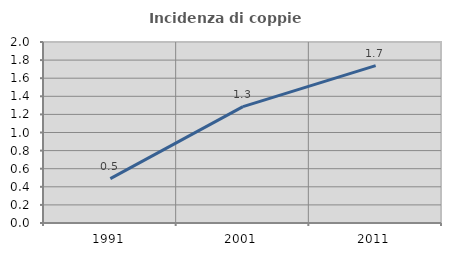
| Category | Incidenza di coppie miste |
|---|---|
| 1991.0 | 0.49 |
| 2001.0 | 1.286 |
| 2011.0 | 1.739 |